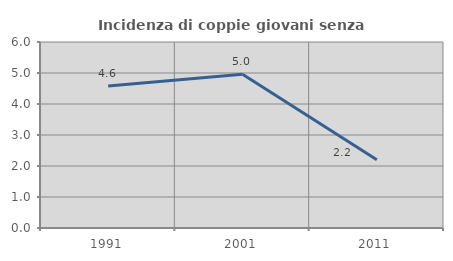
| Category | Incidenza di coppie giovani senza figli |
|---|---|
| 1991.0 | 4.578 |
| 2001.0 | 4.957 |
| 2011.0 | 2.203 |